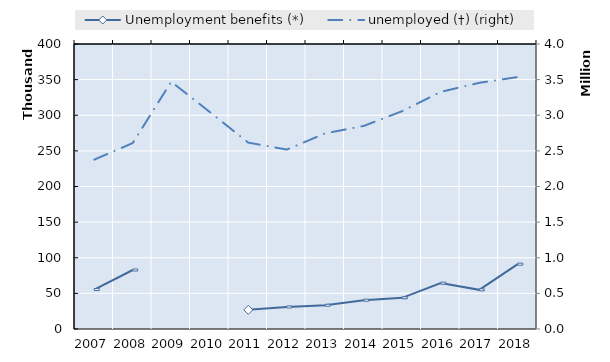
| Category | Series 4 | Series 5 | Series 6 | Series 7 | Series 8 | Series 9 | Series 10 | Series 11 | Series 12 | Series 13 | Series 14 | Series 15 | Series 16 | Series 17 | Series 18 | Series 19 | Unemployment benefits (*) | Series 1 |
|---|---|---|---|---|---|---|---|---|---|---|---|---|---|---|---|---|---|---|
| 2007.0 |  |  |  |  |  |  |  |  |  |  |  |  |  |  |  |  | 55346.5 |  |
| 2008.0 |  |  |  |  |  |  |  |  |  |  |  |  |  |  |  |  | 82819.75 |  |
| 2009.0 |  |  |  |  |  |  |  |  |  |  |  |  |  |  |  |  | 0 |  |
| 2010.0 |  |  |  |  |  |  |  |  |  |  |  |  |  |  |  |  | 0 |  |
| 2011.0 |  |  |  |  |  |  |  |  |  |  |  |  |  |  |  |  | 26846.333 |  |
| 2012.0 |  |  |  |  |  |  |  |  |  |  |  |  |  |  |  |  | 30911.5 |  |
| 2013.0 |  |  |  |  |  |  |  |  |  |  |  |  |  |  |  |  | 33387 |  |
| 2014.0 |  |  |  |  |  |  |  |  |  |  |  |  |  |  |  |  | 40480 |  |
| 2015.0 |  |  |  |  |  |  |  |  |  |  |  |  |  |  |  |  | 43735 |  |
| 2016.0 |  |  |  |  |  |  |  |  |  |  |  |  |  |  |  |  | 64449 |  |
| 2017.0 |  |  |  |  |  |  |  |  |  |  |  |  |  |  |  |  | 54958 |  |
| 2018.0 |  |  |  |  |  |  |  |  |  |  |  |  |  |  |  |  | 91011 |  |